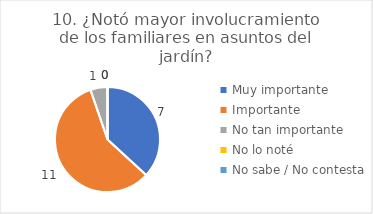
| Category | 10. ¿Notó mayor involucramiento de los familiares en asuntos del jardín? |
|---|---|
| Muy importante  | 0.368 |
| Importante  | 0.579 |
| No tan importante  | 0.053 |
| No lo noté  | 0 |
| No sabe / No contesta | 0 |